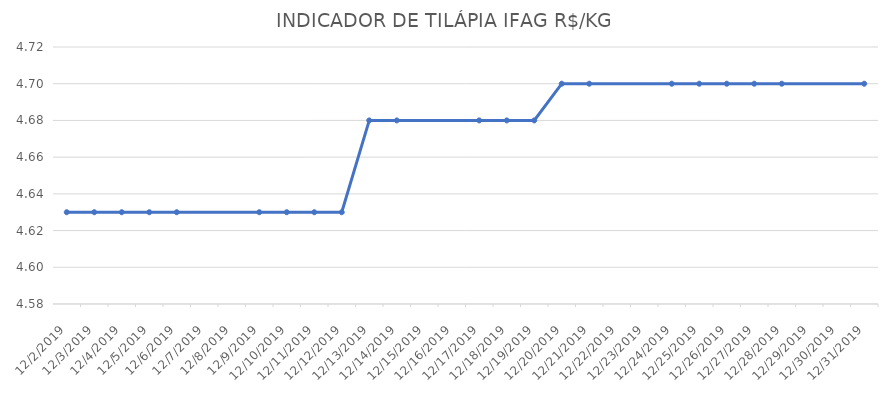
| Category | INDICADOR DE TILÁPIA IFAG |
|---|---|
| 12/2/19 | 4.63 |
| 12/3/19 | 4.63 |
| 12/4/19 | 4.63 |
| 12/5/19 | 4.63 |
| 12/6/19 | 4.63 |
| 12/9/19 | 4.63 |
| 12/10/19 | 4.63 |
| 12/11/19 | 4.63 |
| 12/12/19 | 4.63 |
| 12/13/19 | 4.68 |
| 12/14/19 | 4.68 |
| 12/17/19 | 4.68 |
| 12/18/19 | 4.68 |
| 12/19/19 | 4.68 |
| 12/20/19 | 4.7 |
| 12/21/19 | 4.7 |
| 12/24/19 | 4.7 |
| 12/25/19 | 4.7 |
| 12/26/19 | 4.7 |
| 12/27/19 | 4.7 |
| 12/28/19 | 4.7 |
| 12/31/19 | 4.7 |